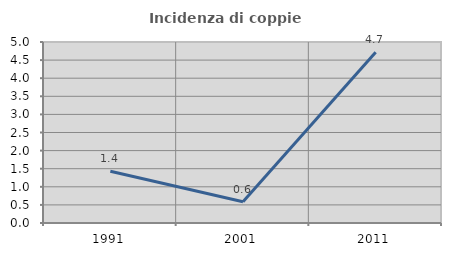
| Category | Incidenza di coppie miste |
|---|---|
| 1991.0 | 1.429 |
| 2001.0 | 0.585 |
| 2011.0 | 4.717 |